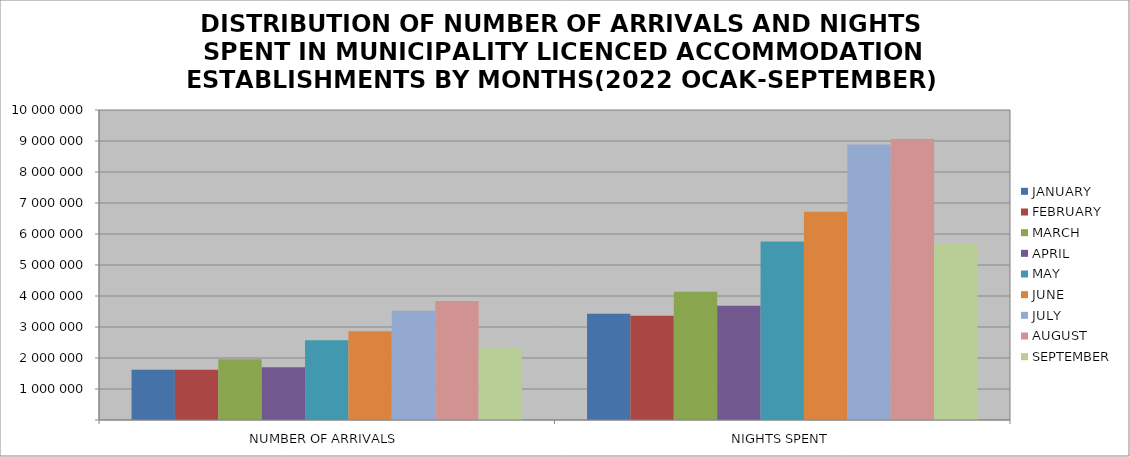
| Category | JANUARY | FEBRUARY | MARCH | APRIL | MAY | JUNE | JULY | AUGUST | SEPTEMBER |
|---|---|---|---|---|---|---|---|---|---|
| NUMBER OF ARRIVALS | 1617436 | 1619305 | 1960867 | 1699422 | 2574819 | 2859746 | 3526528 | 3842457 | 2312458 |
| NIGHTS SPENT | 3427709 | 3362025 | 4136510 | 3684991 | 5758959 | 6716122 | 8890725 | 9063514 | 5685276 |